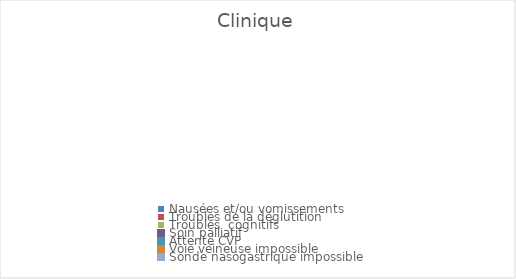
| Category | Clinique |
|---|---|
| Nausées et/ou vomissements | 0 |
| Troubles de la déglutition | 0 |
| Troubles  cognitifs | 0 |
| Soin palliatif | 0 |
| Attente CVP | 0 |
| Voie veineuse impossible | 0 |
| Sonde nasogastrique impossible | 0 |